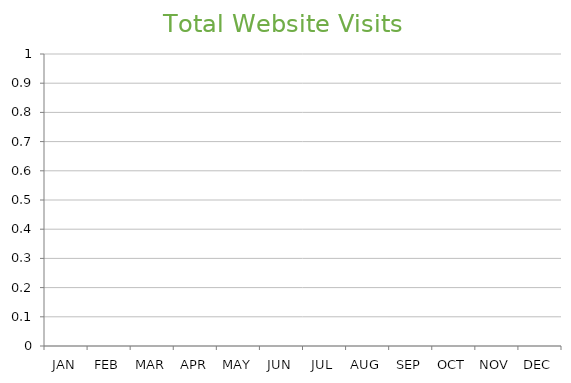
| Category | Total All Sources |
|---|---|
| JAN | 0 |
| FEB | 0 |
| MAR | 0 |
| APR | 0 |
| MAY | 0 |
| JUN | 0 |
| JUL | 0 |
| AUG | 0 |
| SEP | 0 |
| OCT | 0 |
| NOV | 0 |
| DEC | 0 |